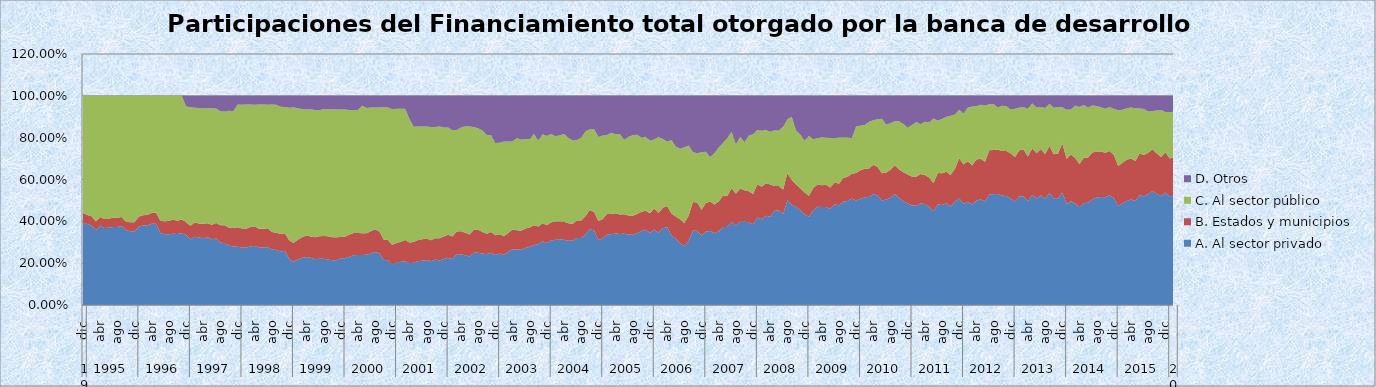
| Category | A. Al sector privado  | B. Estados y municipios  | C. Al sector público  | D. Otros  |
|---|---|---|---|---|
| 0 | 0.395 | 0.045 | 0.561 | 0 |
| 1 | 0.387 | 0.044 | 0.569 | 0 |
| 2 | 0.38 | 0.044 | 0.576 | 0 |
| 3 | 0.357 | 0.042 | 0.601 | 0 |
| 4 | 0.377 | 0.043 | 0.58 | 0 |
| 5 | 0.368 | 0.043 | 0.589 | 0 |
| 6 | 0.369 | 0.043 | 0.588 | 0 |
| 7 | 0.373 | 0.044 | 0.583 | 0 |
| 8 | 0.373 | 0.044 | 0.583 | 0 |
| 9 | 0.378 | 0.043 | 0.579 | 0 |
| 10 | 0.358 | 0.039 | 0.602 | 0 |
| 11 | 0.352 | 0.043 | 0.604 | 0 |
| 12 | 0.35 | 0.045 | 0.605 | 0 |
| 13 | 0.374 | 0.049 | 0.577 | 0 |
| 14 | 0.38 | 0.05 | 0.571 | 0 |
| 15 | 0.381 | 0.051 | 0.569 | 0 |
| 16 | 0.388 | 0.052 | 0.56 | 0 |
| 17 | 0.388 | 0.054 | 0.558 | 0 |
| 18 | 0.344 | 0.059 | 0.597 | 0 |
| 19 | 0.338 | 0.061 | 0.601 | 0 |
| 20 | 0.339 | 0.064 | 0.597 | 0 |
| 21 | 0.341 | 0.067 | 0.593 | 0 |
| 22 | 0.34 | 0.063 | 0.597 | 0 |
| 23 | 0.343 | 0.065 | 0.592 | 0 |
| 24 | 0.335 | 0.061 | 0.554 | 0.05 |
| 25 | 0.313 | 0.066 | 0.566 | 0.055 |
| 26 | 0.326 | 0.068 | 0.549 | 0.057 |
| 27 | 0.323 | 0.067 | 0.552 | 0.058 |
| 28 | 0.319 | 0.069 | 0.553 | 0.059 |
| 29 | 0.324 | 0.067 | 0.55 | 0.059 |
| 30 | 0.314 | 0.07 | 0.557 | 0.059 |
| 31 | 0.318 | 0.075 | 0.548 | 0.06 |
| 32 | 0.298 | 0.083 | 0.545 | 0.074 |
| 33 | 0.296 | 0.086 | 0.544 | 0.075 |
| 34 | 0.283 | 0.087 | 0.559 | 0.072 |
| 35 | 0.28 | 0.088 | 0.558 | 0.073 |
| 36 | 0.279 | 0.093 | 0.587 | 0.041 |
| 37 | 0.275 | 0.09 | 0.592 | 0.042 |
| 38 | 0.274 | 0.09 | 0.594 | 0.041 |
| 39 | 0.281 | 0.092 | 0.586 | 0.042 |
| 40 | 0.282 | 0.093 | 0.583 | 0.042 |
| 41 | 0.275 | 0.09 | 0.594 | 0.041 |
| 42 | 0.275 | 0.09 | 0.594 | 0.042 |
| 43 | 0.277 | 0.09 | 0.59 | 0.043 |
| 44 | 0.265 | 0.084 | 0.61 | 0.041 |
| 45 | 0.263 | 0.083 | 0.612 | 0.042 |
| 46 | 0.256 | 0.083 | 0.608 | 0.053 |
| 47 | 0.259 | 0.085 | 0.603 | 0.053 |
| 48 | 0.219 | 0.09 | 0.634 | 0.057 |
| 49 | 0.207 | 0.089 | 0.649 | 0.055 |
| 50 | 0.218 | 0.095 | 0.628 | 0.06 |
| 51 | 0.224 | 0.1 | 0.613 | 0.062 |
| 52 | 0.229 | 0.104 | 0.602 | 0.065 |
| 53 | 0.226 | 0.101 | 0.609 | 0.064 |
| 54 | 0.219 | 0.105 | 0.608 | 0.068 |
| 55 | 0.221 | 0.107 | 0.603 | 0.069 |
| 56 | 0.221 | 0.109 | 0.606 | 0.063 |
| 57 | 0.218 | 0.111 | 0.607 | 0.064 |
| 58 | 0.214 | 0.11 | 0.612 | 0.064 |
| 59 | 0.214 | 0.111 | 0.61 | 0.066 |
| 60 | 0.224 | 0.101 | 0.611 | 0.064 |
| 61 | 0.224 | 0.103 | 0.608 | 0.066 |
| 62 | 0.23 | 0.106 | 0.596 | 0.068 |
| 63 | 0.237 | 0.107 | 0.588 | 0.068 |
| 64 | 0.238 | 0.106 | 0.588 | 0.068 |
| 65 | 0.239 | 0.105 | 0.609 | 0.047 |
| 66 | 0.24 | 0.103 | 0.598 | 0.058 |
| 67 | 0.246 | 0.107 | 0.592 | 0.055 |
| 68 | 0.253 | 0.109 | 0.582 | 0.056 |
| 69 | 0.246 | 0.106 | 0.593 | 0.055 |
| 70 | 0.216 | 0.097 | 0.633 | 0.054 |
| 71 | 0.214 | 0.097 | 0.633 | 0.056 |
| 72 | 0.195 | 0.091 | 0.649 | 0.064 |
| 73 | 0.202 | 0.094 | 0.642 | 0.062 |
| 74 | 0.207 | 0.095 | 0.636 | 0.062 |
| 75 | 0.209 | 0.102 | 0.627 | 0.062 |
| 76 | 0.2 | 0.099 | 0.59 | 0.111 |
| 77 | 0.202 | 0.099 | 0.551 | 0.147 |
| 78 | 0.21 | 0.101 | 0.543 | 0.146 |
| 79 | 0.212 | 0.103 | 0.538 | 0.147 |
| 80 | 0.215 | 0.103 | 0.536 | 0.147 |
| 81 | 0.21 | 0.1 | 0.541 | 0.149 |
| 82 | 0.218 | 0.102 | 0.532 | 0.149 |
| 83 | 0.213 | 0.106 | 0.535 | 0.147 |
| 84 | 0.22 | 0.107 | 0.521 | 0.152 |
| 85 | 0.226 | 0.11 | 0.512 | 0.152 |
| 86 | 0.219 | 0.109 | 0.508 | 0.164 |
| 87 | 0.244 | 0.108 | 0.485 | 0.163 |
| 88 | 0.241 | 0.112 | 0.496 | 0.151 |
| 89 | 0.238 | 0.108 | 0.509 | 0.146 |
| 90 | 0.232 | 0.104 | 0.517 | 0.146 |
| 91 | 0.249 | 0.11 | 0.491 | 0.149 |
| 92 | 0.25 | 0.109 | 0.485 | 0.155 |
| 93 | 0.246 | 0.102 | 0.486 | 0.166 |
| 94 | 0.242 | 0.098 | 0.473 | 0.187 |
| 95 | 0.25 | 0.099 | 0.463 | 0.188 |
| 96 | 0.238 | 0.095 | 0.441 | 0.225 |
| 97 | 0.246 | 0.092 | 0.438 | 0.224 |
| 98 | 0.238 | 0.09 | 0.453 | 0.218 |
| 99 | 0.254 | 0.091 | 0.437 | 0.219 |
| 100 | 0.266 | 0.094 | 0.421 | 0.218 |
| 101 | 0.265 | 0.092 | 0.441 | 0.202 |
| 102 | 0.264 | 0.091 | 0.435 | 0.21 |
| 103 | 0.273 | 0.093 | 0.428 | 0.206 |
| 104 | 0.279 | 0.092 | 0.423 | 0.206 |
| 105 | 0.287 | 0.094 | 0.437 | 0.182 |
| 106 | 0.291 | 0.084 | 0.411 | 0.214 |
| 107 | 0.305 | 0.086 | 0.426 | 0.183 |
| 108 | 0.297 | 0.084 | 0.426 | 0.192 |
| 109 | 0.308 | 0.087 | 0.422 | 0.182 |
| 110 | 0.312 | 0.086 | 0.409 | 0.193 |
| 111 | 0.314 | 0.085 | 0.412 | 0.188 |
| 112 | 0.312 | 0.086 | 0.42 | 0.182 |
| 113 | 0.308 | 0.084 | 0.408 | 0.201 |
| 114 | 0.307 | 0.082 | 0.398 | 0.214 |
| 115 | 0.32 | 0.084 | 0.384 | 0.211 |
| 116 | 0.32 | 0.084 | 0.396 | 0.199 |
| 117 | 0.337 | 0.088 | 0.406 | 0.169 |
| 118 | 0.364 | 0.091 | 0.386 | 0.159 |
| 119 | 0.356 | 0.088 | 0.396 | 0.16 |
| 120 | 0.311 | 0.091 | 0.401 | 0.197 |
| 121 | 0.318 | 0.093 | 0.399 | 0.19 |
| 122 | 0.337 | 0.098 | 0.378 | 0.188 |
| 123 | 0.339 | 0.096 | 0.388 | 0.177 |
| 124 | 0.342 | 0.097 | 0.378 | 0.184 |
| 125 | 0.339 | 0.094 | 0.383 | 0.184 |
| 126 | 0.341 | 0.093 | 0.356 | 0.209 |
| 127 | 0.337 | 0.091 | 0.376 | 0.196 |
| 128 | 0.336 | 0.091 | 0.384 | 0.189 |
| 129 | 0.343 | 0.091 | 0.379 | 0.186 |
| 130 | 0.353 | 0.092 | 0.355 | 0.199 |
| 131 | 0.36 | 0.091 | 0.353 | 0.196 |
| 132 | 0.345 | 0.094 | 0.346 | 0.215 |
| 133 | 0.361 | 0.1 | 0.33 | 0.209 |
| 134 | 0.346 | 0.094 | 0.365 | 0.195 |
| 135 | 0.367 | 0.098 | 0.329 | 0.206 |
| 136 | 0.373 | 0.1 | 0.309 | 0.218 |
| 137 | 0.333 | 0.105 | 0.351 | 0.212 |
| 138 | 0.316 | 0.106 | 0.336 | 0.242 |
| 139 | 0.295 | 0.115 | 0.338 | 0.253 |
| 140 | 0.281 | 0.111 | 0.363 | 0.246 |
| 141 | 0.306 | 0.121 | 0.335 | 0.237 |
| 142 | 0.355 | 0.138 | 0.238 | 0.269 |
| 143 | 0.355 | 0.135 | 0.236 | 0.275 |
| 144 | 0.331 | 0.124 | 0.275 | 0.27 |
| 145 | 0.351 | 0.136 | 0.245 | 0.267 |
| 146 | 0.354 | 0.141 | 0.213 | 0.293 |
| 147 | 0.343 | 0.138 | 0.245 | 0.274 |
| 148 | 0.352 | 0.142 | 0.259 | 0.247 |
| 149 | 0.373 | 0.15 | 0.252 | 0.225 |
| 150 | 0.373 | 0.148 | 0.278 | 0.201 |
| 151 | 0.399 | 0.159 | 0.27 | 0.172 |
| 152 | 0.379 | 0.153 | 0.236 | 0.233 |
| 153 | 0.401 | 0.156 | 0.247 | 0.196 |
| 154 | 0.399 | 0.149 | 0.23 | 0.221 |
| 155 | 0.396 | 0.148 | 0.266 | 0.19 |
| 156 | 0.386 | 0.145 | 0.286 | 0.184 |
| 157 | 0.418 | 0.16 | 0.259 | 0.163 |
| 158 | 0.41 | 0.155 | 0.268 | 0.167 |
| 159 | 0.426 | 0.156 | 0.255 | 0.163 |
| 160 | 0.422 | 0.154 | 0.253 | 0.171 |
| 161 | 0.451 | 0.119 | 0.266 | 0.164 |
| 162 | 0.451 | 0.118 | 0.264 | 0.166 |
| 163 | 0.435 | 0.117 | 0.3 | 0.147 |
| 164 | 0.502 | 0.128 | 0.258 | 0.112 |
| 165 | 0.479 | 0.118 | 0.303 | 0.1 |
| 166 | 0.469 | 0.107 | 0.258 | 0.165 |
| 167 | 0.453 | 0.105 | 0.257 | 0.184 |
| 168 | 0.434 | 0.103 | 0.248 | 0.215 |
| 169 | 0.422 | 0.101 | 0.286 | 0.191 |
| 170 | 0.453 | 0.106 | 0.233 | 0.207 |
| 171 | 0.47 | 0.105 | 0.221 | 0.203 |
| 172 | 0.469 | 0.104 | 0.23 | 0.197 |
| 173 | 0.469 | 0.106 | 0.227 | 0.199 |
| 174 | 0.459 | 0.102 | 0.237 | 0.201 |
| 175 | 0.481 | 0.105 | 0.21 | 0.203 |
| 176 | 0.476 | 0.104 | 0.222 | 0.198 |
| 177 | 0.495 | 0.113 | 0.195 | 0.198 |
| 178 | 0.497 | 0.117 | 0.188 | 0.198 |
| 179 | 0.509 | 0.118 | 0.171 | 0.202 |
| 180 | 0.499 | 0.131 | 0.223 | 0.146 |
| 181 | 0.508 | 0.137 | 0.213 | 0.143 |
| 182 | 0.516 | 0.136 | 0.209 | 0.139 |
| 183 | 0.517 | 0.136 | 0.224 | 0.124 |
| 184 | 0.531 | 0.139 | 0.214 | 0.117 |
| 185 | 0.523 | 0.137 | 0.229 | 0.112 |
| 186 | 0.499 | 0.131 | 0.26 | 0.11 |
| 187 | 0.504 | 0.13 | 0.229 | 0.137 |
| 188 | 0.513 | 0.134 | 0.221 | 0.131 |
| 189 | 0.53 | 0.138 | 0.211 | 0.12 |
| 190 | 0.513 | 0.134 | 0.231 | 0.121 |
| 191 | 0.495 | 0.139 | 0.231 | 0.134 |
| 192 | 0.487 | 0.138 | 0.223 | 0.153 |
| 193 | 0.475 | 0.139 | 0.247 | 0.139 |
| 194 | 0.475 | 0.139 | 0.261 | 0.125 |
| 195 | 0.485 | 0.141 | 0.238 | 0.136 |
| 196 | 0.483 | 0.139 | 0.255 | 0.124 |
| 197 | 0.47 | 0.14 | 0.263 | 0.128 |
| 198 | 0.449 | 0.134 | 0.309 | 0.109 |
| 199 | 0.482 | 0.15 | 0.25 | 0.118 |
| 200 | 0.478 | 0.152 | 0.259 | 0.111 |
| 201 | 0.486 | 0.151 | 0.263 | 0.1 |
| 202 | 0.471 | 0.15 | 0.283 | 0.096 |
| 203 | 0.495 | 0.157 | 0.259 | 0.089 |
| 204 | 0.51 | 0.191 | 0.233 | 0.066 |
| 205 | 0.484 | 0.188 | 0.243 | 0.085 |
| 206 | 0.494 | 0.193 | 0.257 | 0.056 |
| 207 | 0.481 | 0.187 | 0.282 | 0.051 |
| 208 | 0.499 | 0.196 | 0.254 | 0.05 |
| 209 | 0.505 | 0.195 | 0.258 | 0.043 |
| 210 | 0.494 | 0.191 | 0.269 | 0.046 |
| 211 | 0.529 | 0.211 | 0.22 | 0.04 |
| 212 | 0.529 | 0.212 | 0.22 | 0.039 |
| 213 | 0.53 | 0.213 | 0.202 | 0.055 |
| 214 | 0.522 | 0.215 | 0.216 | 0.047 |
| 215 | 0.521 | 0.215 | 0.215 | 0.049 |
| 216 | 0.508 | 0.217 | 0.211 | 0.065 |
| 217 | 0.495 | 0.213 | 0.23 | 0.062 |
| 218 | 0.518 | 0.221 | 0.205 | 0.056 |
| 219 | 0.52 | 0.222 | 0.204 | 0.054 |
| 220 | 0.496 | 0.214 | 0.229 | 0.061 |
| 221 | 0.527 | 0.223 | 0.213 | 0.037 |
| 222 | 0.509 | 0.217 | 0.219 | 0.055 |
| 223 | 0.523 | 0.223 | 0.2 | 0.053 |
| 224 | 0.507 | 0.214 | 0.221 | 0.058 |
| 225 | 0.536 | 0.224 | 0.202 | 0.038 |
| 226 | 0.508 | 0.213 | 0.223 | 0.056 |
| 227 | 0.508 | 0.217 | 0.22 | 0.055 |
| 228 | 0.537 | 0.235 | 0.173 | 0.054 |
| 229 | 0.484 | 0.215 | 0.235 | 0.066 |
| 230 | 0.496 | 0.224 | 0.215 | 0.065 |
| 231 | 0.485 | 0.218 | 0.251 | 0.047 |
| 232 | 0.468 | 0.206 | 0.273 | 0.053 |
| 233 | 0.488 | 0.215 | 0.253 | 0.043 |
| 234 | 0.489 | 0.216 | 0.239 | 0.056 |
| 235 | 0.506 | 0.224 | 0.224 | 0.046 |
| 236 | 0.514 | 0.22 | 0.217 | 0.049 |
| 237 | 0.516 | 0.218 | 0.212 | 0.055 |
| 238 | 0.515 | 0.213 | 0.211 | 0.061 |
| 239 | 0.524 | 0.212 | 0.211 | 0.053 |
| 240 | 0.512 | 0.205 | 0.222 | 0.061 |
| 241 | 0.473 | 0.192 | 0.266 | 0.069 |
| 242 | 0.486 | 0.194 | 0.253 | 0.067 |
| 243 | 0.498 | 0.196 | 0.247 | 0.059 |
| 244 | 0.504 | 0.197 | 0.243 | 0.056 |
| 245 | 0.497 | 0.191 | 0.253 | 0.059 |
| 246 | 0.526 | 0.199 | 0.214 | 0.061 |
| 247 | 0.519 | 0.198 | 0.219 | 0.063 |
| 248 | 0.531 | 0.197 | 0.197 | 0.075 |
| 249 | 0.546 | 0.199 | 0.183 | 0.072 |
| 250 | 0.532 | 0.193 | 0.206 | 0.07 |
| 251 | 0.519 | 0.188 | 0.224 | 0.068 |
| 252 | 0.539 | 0.192 | 0.192 | 0.078 |
| 253 | 0.519 | 0.181 | 0.222 | 0.078 |
| 254 | 0.523 | 0.184 | 0.218 | 0.075 |